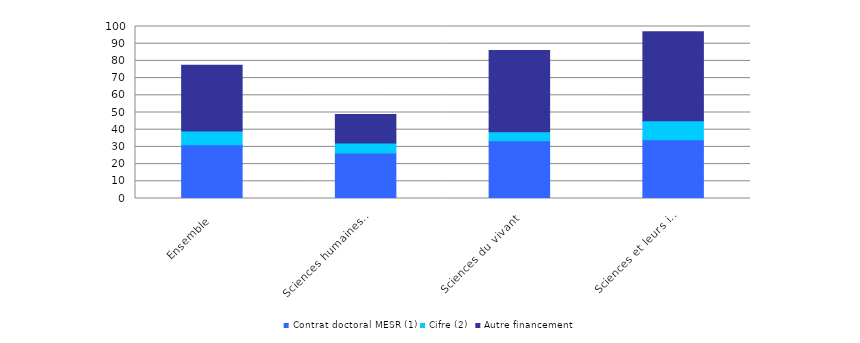
| Category | Contrat doctoral MESR (1) | Cifre (2) | Autre financement |
|---|---|---|---|
| Sciences et leurs interactions | 34.1 | 11.1 | 51.7 |
| Sciences du vivant | 33.6 | 5.2 | 47.2 |
| Sciences humaines et sociales | 26.4 | 5.8 | 16.6 |
| Ensemble | 31.2 | 8 | 38.3 |